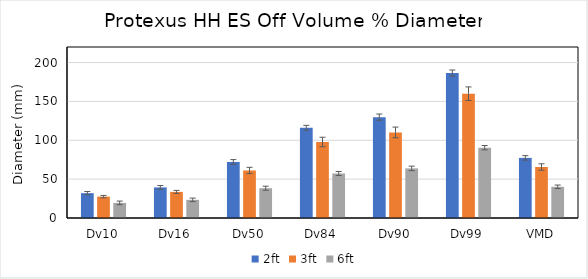
| Category | 2ft | 3ft | 6ft |
|---|---|---|---|
| Dv10 | 31.974 | 27.512 | 19.427 |
| Dv16 | 39.352 | 33.582 | 23.36 |
| Dv50 | 72.102 | 61.14 | 38.336 |
| Dv84 | 116.066 | 97.77 | 57.275 |
| Dv90 | 129.77 | 110.132 | 63.818 |
| Dv99 | 186.444 | 159.906 | 90.459 |
| VMD | 77.356 | 65.63 | 40.13 |